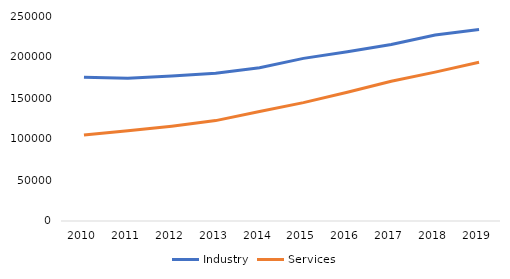
| Category | Industry | Services |
|---|---|---|
| 2010.0 | 175354 | 104857 |
| 2011.0 | 174114 | 110126 |
| 2012.0 | 176979 | 115680 |
| 2013.0 | 180168 | 122432 |
| 2014.0 | 186858 | 133575 |
| 2015.0 | 198351 | 144346 |
| 2016.0 | 206349 | 157041 |
| 2017.0 | 215181 | 170409 |
| 2018.0 | 226932 | 181586 |
| 2019.0 | 233453 | 193698 |